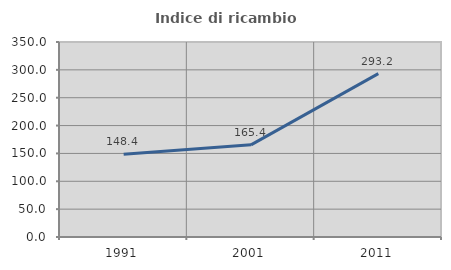
| Category | Indice di ricambio occupazionale  |
|---|---|
| 1991.0 | 148.387 |
| 2001.0 | 165.385 |
| 2011.0 | 293.22 |